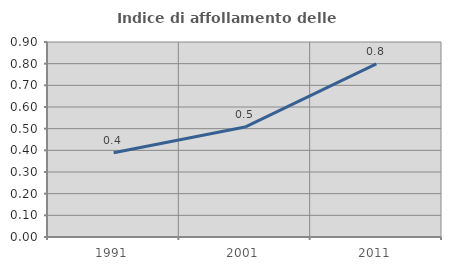
| Category | Indice di affollamento delle abitazioni  |
|---|---|
| 1991.0 | 0.389 |
| 2001.0 | 0.507 |
| 2011.0 | 0.799 |